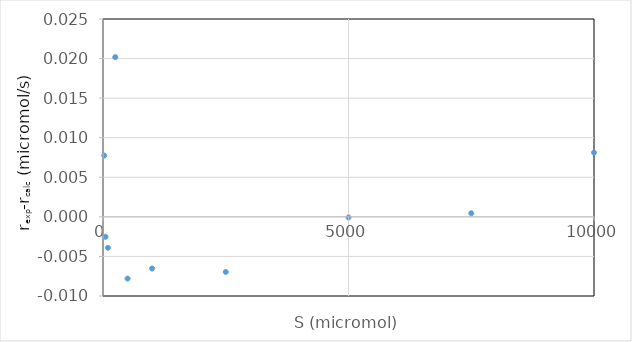
| Category | rexp-rcalc |
|---|---|
| 25.0 | 0.008 |
| 50.0 | -0.003 |
| 100.0 | -0.004 |
| 250.0 | 0.02 |
| 500.0 | -0.008 |
| 1000.0 | -0.007 |
| 2500.0 | -0.007 |
| 5000.0 | 0 |
| 7500.0 | 0 |
| 10000.0 | 0.008 |